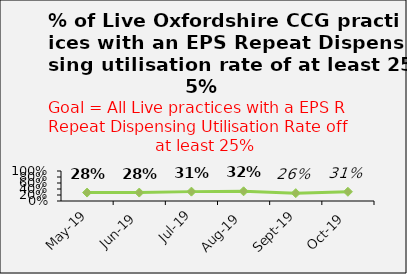
| Category | Series 0 |
|---|---|
| 2019-05-01 | 0.281 |
| 2019-06-01 | 0.281 |
| 2019-07-01 | 0.312 |
| 2019-08-01 | 0.323 |
| 2019-09-01 | 0.262 |
| 2019-10-01 | 0.308 |